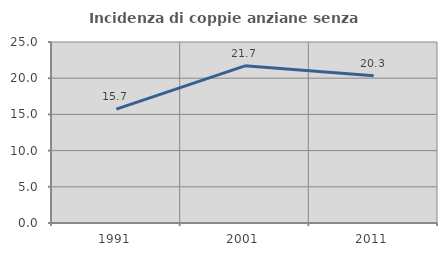
| Category | Incidenza di coppie anziane senza figli  |
|---|---|
| 1991.0 | 15.739 |
| 2001.0 | 21.712 |
| 2011.0 | 20.323 |